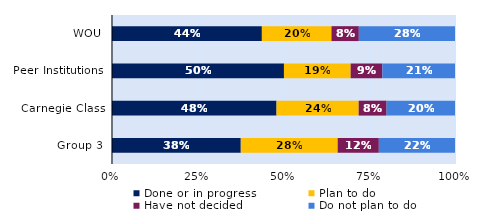
| Category | Done or in progress | Plan to do | Have not decided | Do not plan to do |
|---|---|---|---|---|
| WOU | 0.437 | 0.203 | 0.08 | 0.28 |
| Peer Institutions | 0.501 | 0.194 | 0.092 | 0.212 |
| Carnegie Class | 0.48 | 0.24 | 0.081 | 0.2 |
| Group 3 | 0.375 | 0.283 | 0.12 | 0.222 |